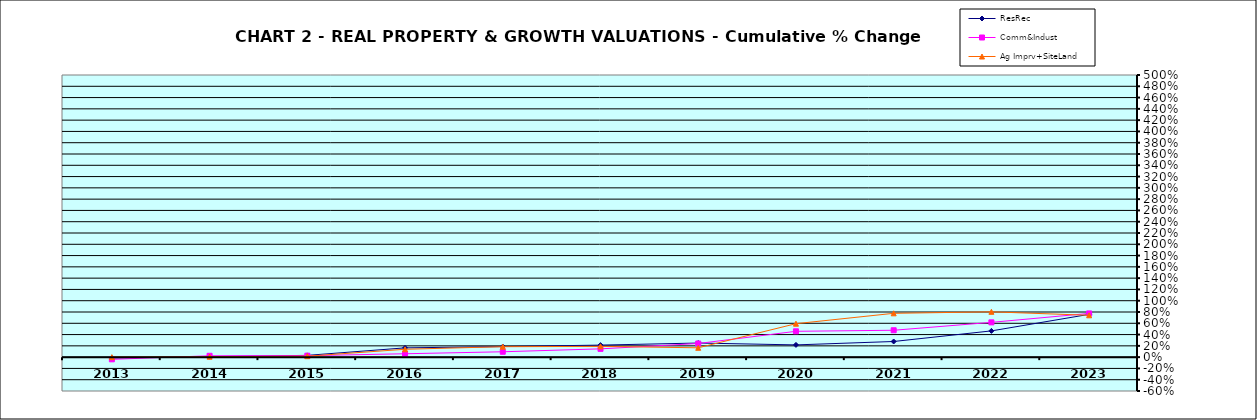
| Category | ResRec | Comm&Indust | Ag Imprv+SiteLand |
|---|---|---|---|
| 2013.0 | -0.014 | -0.039 | 0 |
| 2014.0 | 0.009 | 0.024 | 0.008 |
| 2015.0 | 0.031 | 0.026 | 0.017 |
| 2016.0 | 0.164 | 0.06 | 0.139 |
| 2017.0 | 0.187 | 0.095 | 0.185 |
| 2018.0 | 0.213 | 0.147 | 0.191 |
| 2019.0 | 0.25 | 0.242 | 0.165 |
| 2020.0 | 0.217 | 0.458 | 0.593 |
| 2021.0 | 0.277 | 0.476 | 0.777 |
| 2022.0 | 0.465 | 0.616 | 0.804 |
| 2023.0 | 0.758 | 0.775 | 0.742 |